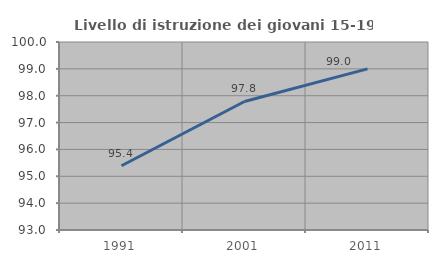
| Category | Livello di istruzione dei giovani 15-19 anni |
|---|---|
| 1991.0 | 95.394 |
| 2001.0 | 97.785 |
| 2011.0 | 99 |